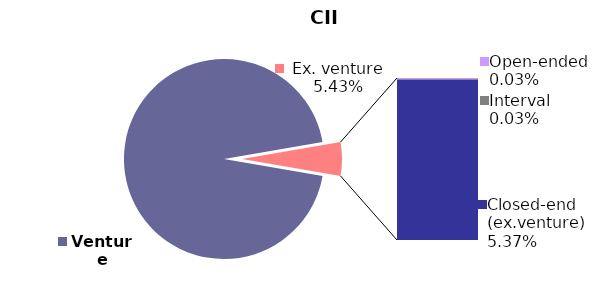
| Category | 31.03.2020 |
|---|---|
| Venture | 0.946 |
| Open-ended | 0 |
| Interval | 0 |
| Closed-end (ex.venture) | 0.054 |